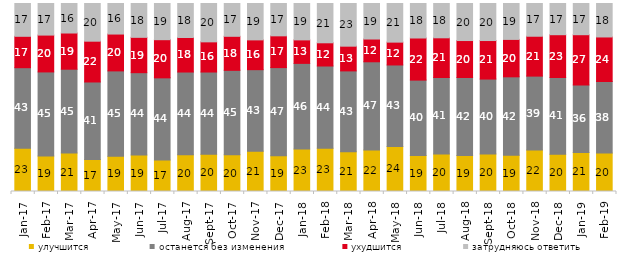
| Category | улучшится | останется без изменения | ухудшится | затрудняюсь ответить |
|---|---|---|---|---|
| 2017-01-01 | 23 | 42.85 | 16.7 | 17.45 |
| 2017-02-01 | 18.85 | 44.75 | 19.6 | 16.8 |
| 2017-03-01 | 20.5 | 44.55 | 19.25 | 15.7 |
| 2017-04-01 | 17 | 41.25 | 21.7 | 20.05 |
| 2017-05-01 | 18.7 | 45.45 | 19.6 | 16.25 |
| 2017-06-01 | 19.4 | 43.8 | 18.8 | 18 |
| 2017-07-01 | 16.7 | 43.75 | 20.3 | 19.25 |
| 2017-08-01 | 19.5 | 44.05 | 18.35 | 18.1 |
| 2017-09-01 | 19.8 | 43.75 | 16.05 | 20.4 |
| 2017-10-01 | 19.55 | 44.9 | 18.1 | 17.45 |
| 2017-11-01 | 21.45 | 43.35 | 15.85 | 19.35 |
| 2017-12-01 | 18.95 | 46.95 | 16.9 | 17.2 |
| 2018-01-01 | 22.55 | 45.6 | 12.5 | 19.35 |
| 2018-02-01 | 23 | 43.75 | 12.35 | 20.9 |
| 2018-03-01 | 21.15 | 43 | 13.15 | 22.7 |
| 2018-04-01 | 22.05 | 46.95 | 12.1 | 18.9 |
| 2018-05-01 | 23.95 | 43.35 | 12.15 | 20.55 |
| 2018-06-01 | 19.15 | 40.1 | 22.4 | 18.35 |
| 2018-07-01 | 19.95 | 40.7 | 21.1 | 18.25 |
| 2018-08-01 | 19.15 | 41.5 | 19.65 | 19.7 |
| 2018-09-01 | 19.95 | 39.85 | 20.5 | 19.7 |
| 2018-10-01 | 19.3 | 41.7 | 19.9 | 19.1 |
| 2018-11-01 | 22.056 | 39.321 | 21.208 | 17.415 |
| 2018-12-01 | 19.8 | 40.85 | 22.75 | 16.6 |
| 2019-01-01 | 20.75 | 35.95 | 26.7 | 16.6 |
| 2019-02-01 | 20.45 | 38.05 | 23.7 | 17.8 |